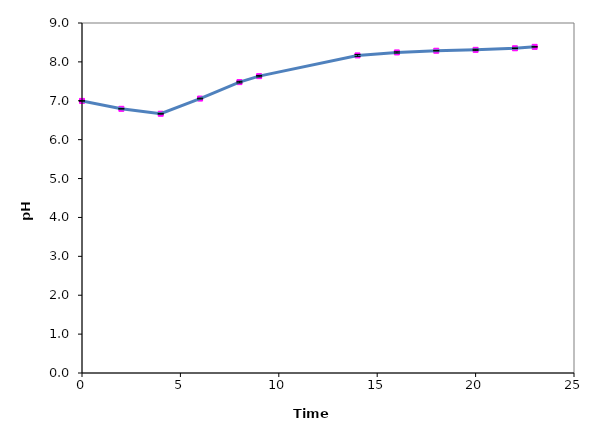
| Category | pH profile |
|---|---|
| 0.0 | 6.997 |
| 2.0 | 6.793 |
| 4.0 | 6.667 |
| 6.0 | 7.057 |
| 8.0 | 7.48 |
| 9.0 | 7.633 |
| 14.0 | 8.167 |
| 16.0 | 8.243 |
| 18.0 | 8.287 |
| 20.0 | 8.31 |
| 22.0 | 8.35 |
| 23.0 | 8.387 |